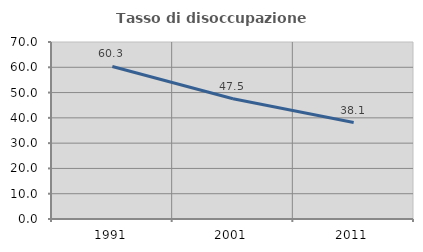
| Category | Tasso di disoccupazione giovanile  |
|---|---|
| 1991.0 | 60.338 |
| 2001.0 | 47.541 |
| 2011.0 | 38.144 |